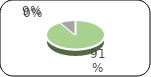
| Category | Series 0 |
|---|---|
| 0 | 24077.9 |
| 1 | 0 |
| 2 | 2325 |